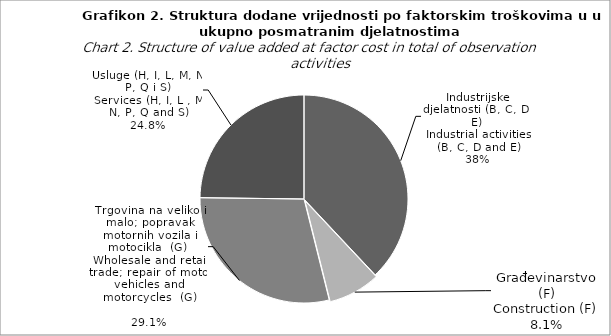
| Category | Dodana vrijednost po faktorskim troškovima
Value added at factor cost |
|---|---|
| Industrijske djelatnosti (B, C, D i E)
Industrial activities (B, C, D and E) | 38 |
| Građevinarstvo (F)
Construction (F) | 8.1 |
| Trgovina na veliko i malo; popravak motornih vozila i motocikla  (G) 
Wholesale and retail trade; repair of motor vehicles and motorcycles  (G)
 | 29.1 |
| Usluge (H, I i L)
Services (H, I and L) | 24.8 |